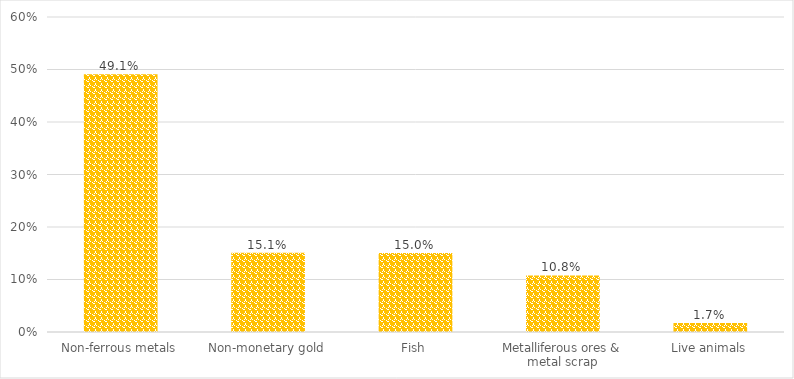
| Category | %Share |
|---|---|
| Non-ferrous metals | 0.491 |
| Non-monetary gold | 0.151 |
| Fish | 0.15 |
| Metalliferous ores & metal scrap | 0.108 |
| Live animals | 0.017 |